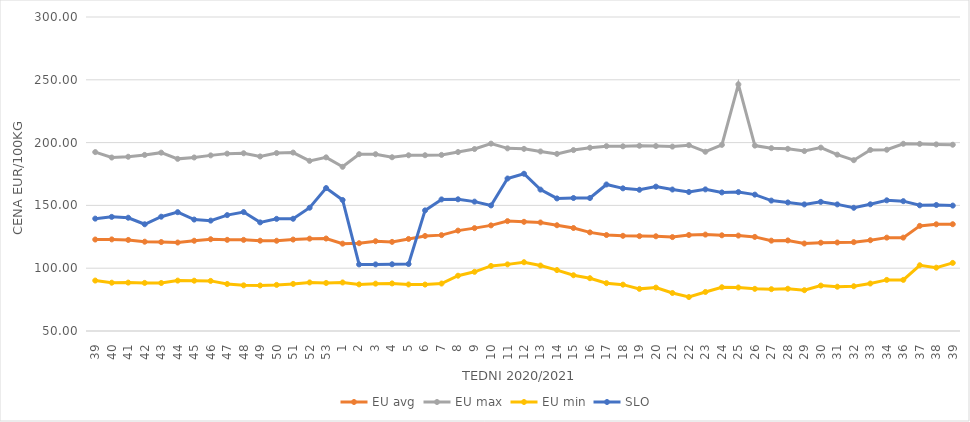
| Category | EU avg | EU max | EU min | SLO |
|---|---|---|---|---|
| 39.0 | 122.832 | 192.45 | 90.16 | 139.46 |
| 40.0 | 122.936 | 188.11 | 88.45 | 140.87 |
| 41.0 | 122.507 | 188.73 | 88.54 | 140.18 |
| 42.0 | 121.098 | 190.2 | 88.3 | 134.98 |
| 43.0 | 120.822 | 191.99 | 88.22 | 141 |
| 44.0 | 120.448 | 187.06 | 90.13 | 144.61 |
| 45.0 | 121.843 | 188.15 | 90.04 | 138.73 |
| 46.0 | 123.07 | 189.82 | 89.89 | 137.88 |
| 47.0 | 122.58 | 191.22 | 87.43 | 142.27 |
| 48.0 | 122.553 | 191.52 | 86.35 | 144.69 |
| 49.0 | 121.893 | 188.97 | 86.24 | 136.47 |
| 50.0 | 121.851 | 191.67 | 86.72 | 139.29 |
| 51.0 | 122.8 | 192.06 | 87.5 | 139.35 |
| 52.0 | 123.52 | 185.468 | 88.67 | 148.16 |
| 53.0 | 123.611 | 188.25 | 88.23 | 163.81 |
| 1.0 | 119.553 | 180.72 | 88.64 | 154.31 |
| 2.0 | 119.893 | 190.77 | 87.1 | 103.02 |
| 3.0 | 121.489 | 190.76 | 87.7 | 103.03 |
| 4.0 | 120.954 | 188.33 | 87.88 | 103.15 |
| 5.0 | 123.293 | 189.91 | 87.04 | 103.34 |
| 6.0 | 125.679 | 189.94 | 86.97 | 146.03 |
| 7.0 | 126.33 | 190.21 | 87.79 | 154.77 |
| 8.0 | 129.933 | 192.48 | 94.02 | 154.86 |
| 9.0 | 131.908 | 194.884 | 97.12 | 153 |
| 10.0 | 134.098 | 199.17 | 101.79 | 149.98 |
| 11.0 | 137.49 | 195.419 | 103.05 | 171.4 |
| 12.0 | 136.929 | 195.013 | 104.76 | 175.2 |
| 13.0 | 136.39 | 192.952 | 102.11 | 162.57 |
| 14.0 | 134.198 | 191.034 | 98.5 | 155.55 |
| 15.0 | 132.003 | 194.047 | 94.39 | 155.88 |
| 16.0 | 128.53 | 195.913 | 92.04 | 155.88 |
| 17.0 | 126.415 | 197.188 | 88.07 | 166.66 |
| 18.0 | 125.787 | 197.055 | 86.89 | 163.58 |
| 19.0 | 125.54 | 197.478 | 83.546 | 162.44 |
| 20.0 | 125.412 | 197.263 | 84.55 | 164.94 |
| 21.0 | 124.768 | 196.821 | 80.264 | 162.64 |
| 22.0 | 126.43 | 197.963 | 77.048 | 160.68 |
| 23.0 | 126.76 | 192.72 | 81.087 | 162.75 |
| 24.0 | 126.19 | 198.186 | 84.83 | 160.34 |
| 25.0 | 125.97 | 246.36 | 84.63 | 160.6 |
| 26.0 | 124.92 | 197.607 | 83.57 | 158.57 |
| 27.0 | 121.922 | 195.566 | 83.3 | 153.83 |
| 28.0 | 122.106 | 195.043 | 83.64 | 152.35 |
| 29.0 | 119.659 | 193.272 | 82.49 | 150.79 |
| 30.0 | 120.3 | 196.01 | 86.16 | 152.82 |
| 31.0 | 120.473 | 190.42 | 85.26 | 150.8 |
| 32.0 | 120.756 | 186 | 85.65 | 148.1 |
| 33.0 | 122.274 | 194.145 | 87.8 | 150.88 |
| 34.0 | 124.332 | 194.304 | 90.69 | 154.04 |
| 36.0 | 124.332 | 199.06 | 90.69 | 153.37 |
| 37.0 | 133.685 | 198.97 | 102.334 | 150.06 |
| 38.0 | 134.959 | 198.57 | 100.43 | 150.32 |
| 39.0 | 135.021 | 198.3 | 104.21 | 149.86 |